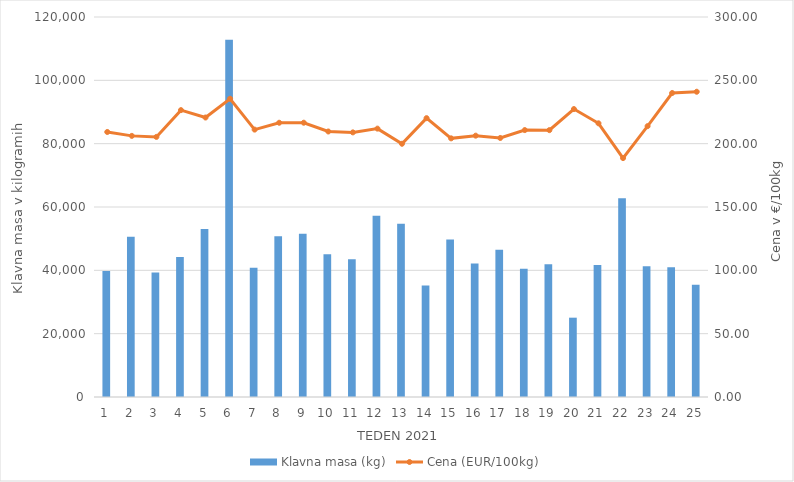
| Category | Klavna masa (kg) |
|---|---|
| 1.0 | 39814 |
| 2.0 | 50603 |
| 3.0 | 39295 |
| 4.0 | 44250 |
| 5.0 | 53061 |
| 6.0 | 112816 |
| 7.0 | 40829 |
| 8.0 | 50775 |
| 9.0 | 51535 |
| 10.0 | 45040 |
| 11.0 | 43536 |
| 12.0 | 57246 |
| 13.0 | 54680 |
| 14.0 | 35237 |
| 15.0 | 49721 |
| 16.0 | 42177 |
| 17.0 | 46525 |
| 18.0 | 40491 |
| 19.0 | 41888 |
| 20.0 | 25048 |
| 21.0 | 41651 |
| 22.0 | 62774 |
| 23.0 | 41297 |
| 24.0 | 40971 |
| 25.0 | 35465 |